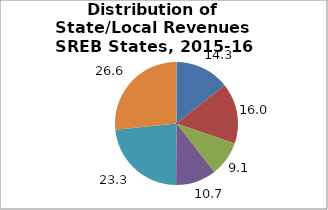
| Category | Series 0 |
|---|---|
| General Sales | 14.303 |
| Property | 15.997 |
| Income1 | 9.149 |
| Other | 10.651 |
| From Federal Government | 23.256 |
| Nontax Revenues2 | 26.643 |